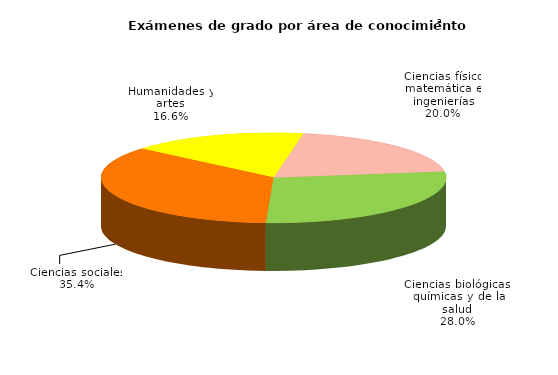
| Category | Series 0 |
|---|---|
| Ciencias físico matemática e ingenierías | 883 |
| Ciencias biológicas, químicas y de la salud | 1238 |
| Ciencias sociales | 1569 |
| Humanidades y artes | 736 |